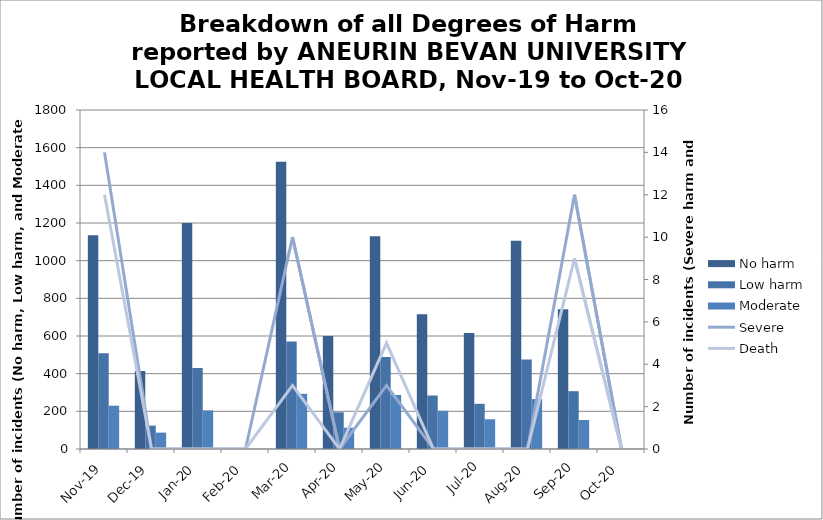
| Category | No harm | Low harm | Moderate |
|---|---|---|---|
| Nov-19 | 1135 | 508 | 230 |
| Dec-19 | 414 | 124 | 87 |
| Jan-20 | 1200 | 430 | 205 |
| Feb-20 | 0 | 0 | 0 |
| Mar-20 | 1525 | 571 | 293 |
| Apr-20 | 600 | 195 | 113 |
| May-20 | 1129 | 489 | 287 |
| Jun-20 | 715 | 284 | 203 |
| Jul-20 | 616 | 240 | 158 |
| Aug-20 | 1106 | 475 | 265 |
| Sep-20 | 742 | 307 | 154 |
| Oct-20 | 0 | 0 | 0 |